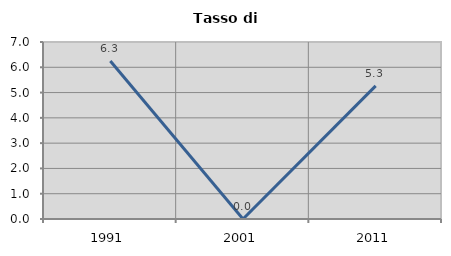
| Category | Tasso di disoccupazione   |
|---|---|
| 1991.0 | 6.25 |
| 2001.0 | 0 |
| 2011.0 | 5.263 |